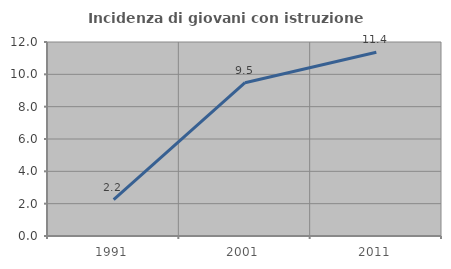
| Category | Incidenza di giovani con istruzione universitaria |
|---|---|
| 1991.0 | 2.247 |
| 2001.0 | 9.483 |
| 2011.0 | 11.364 |